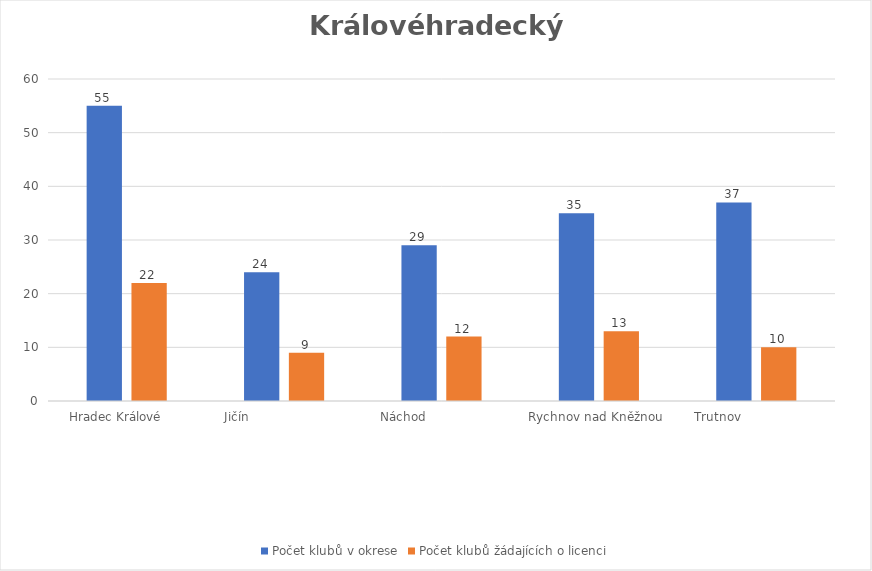
| Category | Počet klubů v okrese | Počet klubů žádajících o licenci |
|---|---|---|
| Hradec Králové      | 55 | 22 |
| Jičín                         | 24 | 9 |
| Náchod                    | 29 | 12 |
| Rychnov nad Kněžnou  | 35 | 13 |
| Trutnov                    | 37 | 10 |